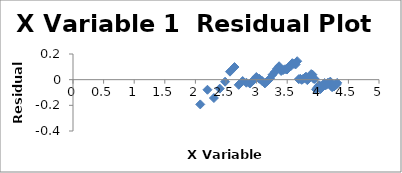
| Category | Series 0 |
|---|---|
| 2.0794415416798357 | -0.193 |
| 2.1972245773362196 | -0.079 |
| 2.302585092994046 | -0.143 |
| 2.3978952727983707 | -0.07 |
| 2.4849066497880004 | -0.016 |
| 2.5649493574615367 | 0.062 |
| 2.6390573296152584 | 0.098 |
| 2.70805020110221 | -0.04 |
| 2.772588722239781 | -0.011 |
| 2.833213344056216 | -0.024 |
| 2.8903717578961645 | -0.03 |
| 2.9444389791664403 | -0.006 |
| 2.995732273553991 | 0.021 |
| 3.044522437723423 | 0.007 |
| 3.091042453358316 | -0.01 |
| 3.1354942159291497 | -0.029 |
| 3.1780538303479458 | -0.011 |
| 3.2188758248682006 | 0.009 |
| 3.258096538021482 | 0.038 |
| 3.295836866004329 | 0.059 |
| 3.332204510175204 | 0.084 |
| 3.367295829986474 | 0.105 |
| 3.4011973816621555 | 0.068 |
| 3.4339872044851463 | 0.075 |
| 3.4657359027997265 | 0.081 |
| 3.4965075614664802 | 0.079 |
| 3.5263605246161616 | 0.101 |
| 3.5553480614894135 | 0.104 |
| 3.58351893845611 | 0.128 |
| 3.6109179126442243 | 0.124 |
| 3.6375861597263857 | 0.119 |
| 3.6635616461296463 | 0.144 |
| 3.6888794541139363 | 0.004 |
| 3.713572066704308 | 0.007 |
| 3.7376696182833684 | -0.001 |
| 3.7612001156935624 | 0.007 |
| 3.784189633918261 | 0.014 |
| 3.8066624897703196 | 0.023 |
| 3.828641396489095 | -0.004 |
| 3.8501476017100584 | 0.009 |
| 3.871201010907891 | 0.024 |
| 3.8918202981106265 | 0.043 |
| 3.912023005428146 | 0.039 |
| 3.9318256327243257 | 0.007 |
| 3.9512437185814275 | 0.005 |
| 3.970291913552122 | -0.076 |
| 3.9889840465642745 | -0.065 |
| 4.007333185232471 | -0.051 |
| 4.02535169073515 | -0.044 |
| 4.04305126783455 | -0.073 |
| 4.060443010546419 | -0.065 |
| 4.07753744390572 | -0.048 |
| 4.0943445622221 | -0.041 |
| 4.110873864173311 | -0.026 |
| 4.127134385045092 | -0.044 |
| 4.143134726391533 | -0.038 |
| 4.1588830833596715 | -0.026 |
| 4.174387269895637 | -0.031 |
| 4.189654742026425 | -0.022 |
| 4.204692619390966 | -0.015 |
| 4.219507705176107 | -0.048 |
| 4.23410650459726 | -0.059 |
| 4.248495242049359 | -0.052 |
| 4.2626798770413155 | -0.054 |
| 4.276666119016055 | -0.041 |
| 4.290459441148391 | -0.044 |
| 4.30406509320417 | -0.037 |
| 4.31748811353631 | -0.025 |